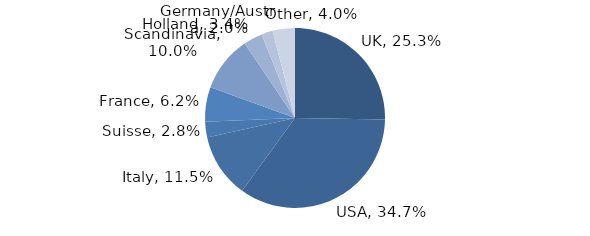
| Category | Investment Style |
|---|---|
| UK | 0.253 |
| USA | 0.347 |
| Italy | 0.115 |
| Suisse | 0.028 |
| France | 0.062 |
| Scandinavia | 0.1 |
| Holland | 0.034 |
| Germany/Austria | 0.02 |
| Other | 0.04 |